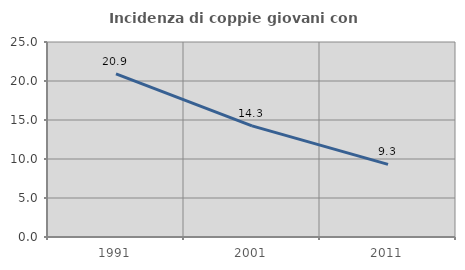
| Category | Incidenza di coppie giovani con figli |
|---|---|
| 1991.0 | 20.908 |
| 2001.0 | 14.253 |
| 2011.0 | 9.307 |